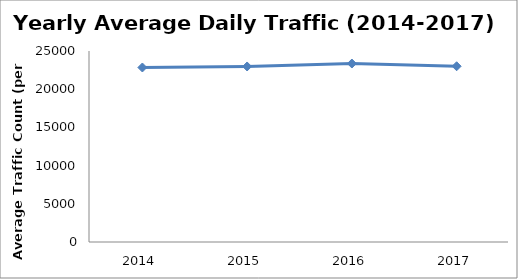
| Category | Series 0 |
|---|---|
| 2014.0 | 22840.397 |
| 2015.0 | 22973.507 |
| 2016.0 | 23359.279 |
| 2017.0 | 23002.304 |